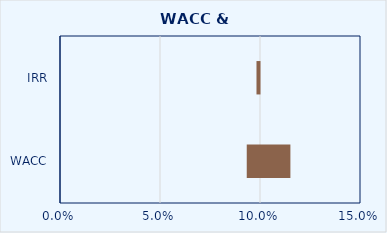
| Category | low | high |
|---|---|---|
| WACC | 0.093 | 0.022 |
| IRR | 0.098 | 0.002 |